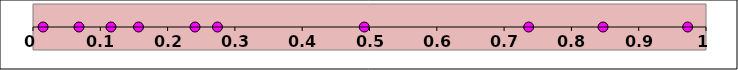
| Category | Series 1 |
|---|---|
| 0.274106642988748 | 0 |
| 0.014959452751224123 | 0 |
| 0.06829250135398923 | 0 |
| 0.24074533904560524 | 0 |
| 0.7364970353312967 | 0 |
| 0.492244781754267 | 0 |
| 0.8470184373582648 | 0 |
| 0.15679604890358434 | 0 |
| 0.9727594681368232 | 0 |
| 0.11585987412325405 | 0 |